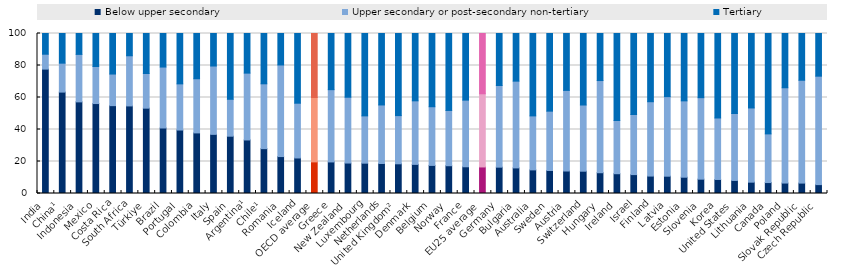
| Category | Below upper secondary | Upper secondary or post-secondary non-tertiary | Tertiary |
|---|---|---|---|
| India | 77.739 | 9.313 | 12.947 |
| China¹ | 63.374 | 18.091 | 18.535 |
| Indonesia | 57.264 | 29.679 | 13.057 |
| Mexico | 56.216 | 23.148 | 20.636 |
| Costa Rica | 54.91 | 19.751 | 25.339 |
| South Africa | 54.733 | 31.353 | 13.914 |
| Türkiye | 53.333 | 21.667 | 25 |
| Brazil | 40.94 | 38.093 | 20.967 |
| Portugal | 39.653 | 28.87 | 31.477 |
| Colombia | 37.872 | 33.855 | 28.273 |
| Italy | 36.962 | 42.716 | 20.322 |
| Spain | 35.818 | 23.069 | 41.113 |
| Argentina¹ | 33.458 | 41.776 | 24.765 |
| Chile¹ | 28.026 | 40.534 | 31.44 |
| Romania | 23.082 | 57.248 | 19.67 |
| Iceland | 22.202 | 34.236 | 43.562 |
| OECD average | 19.754 | 40.23 | 40.44 |
| Greece | 19.724 | 45.172 | 35.104 |
| New Zealand | 19.042 | 41.116 | 39.842 |
| Luxembourg | 18.963 | 29.549 | 51.489 |
| Netherlands | 18.76 | 36.58 | 44.66 |
| United Kingdom² | 18.563 | 30.121 | 51.316 |
| Denmark | 18.205 | 39.712 | 42.083 |
| Belgium | 17.561 | 36.67 | 45.769 |
| Norway | 17.36 | 34.543 | 48.097 |
| France | 16.701 | 41.656 | 41.643 |
| EU25 average | 16.591 | 45.736 | 37.673 |
| Germany | 16.46 | 51.025 | 32.516 |
| Bulgaria | 15.995 | 54.225 | 29.78 |
| Australia | 14.761 | 33.743 | 51.496 |
| Sweden | 14.372 | 37.094 | 48.534 |
| Austria | 14.053 | 50.394 | 35.553 |
| Switzerland | 13.937 | 41.367 | 44.696 |
| Hungary | 12.981 | 57.613 | 29.406 |
| Ireland | 12.366 | 33.247 | 54.386 |
| Israel | 11.815 | 37.565 | 50.62 |
| Finland | 10.892 | 46.471 | 42.637 |
| Latvia | 10.818 | 49.714 | 39.467 |
| Estonia | 10.183 | 47.716 | 42.1 |
| Slovenia | 8.956 | 50.932 | 40.112 |
| Korea | 8.769 | 38.429 | 52.802 |
| United States | 8.158 | 41.825 | 50.017 |
| Lithuania | 7.085 | 46.385 | 46.53 |
| Canada | 6.84 | 30.416 | 62.744 |
| Poland | 6.53 | 59.554 | 33.916 |
| Slovak Republic | 6.503 | 64.281 | 29.217 |
| Czech Republic | 5.55 | 67.78 | 26.67 |